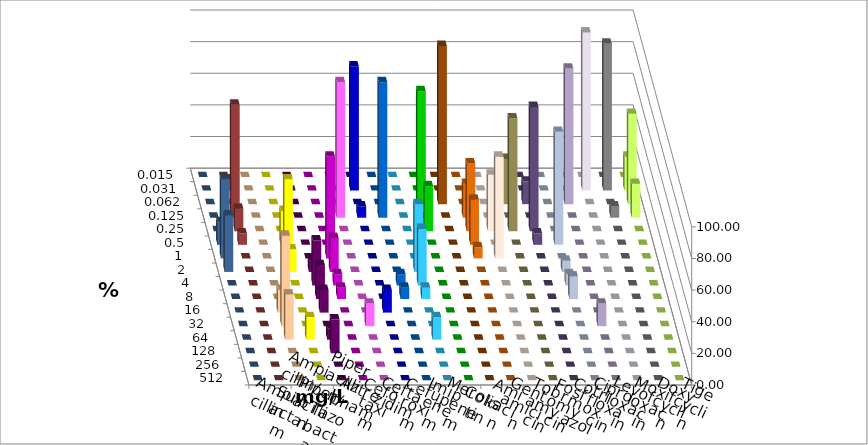
| Category | Ampicillin | Ampicillin/ Sulbactam | Piperacillin | Piperacillin/ Tazobactam | Aztreonam | Cefotaxim | Ceftazidim | Cefuroxim | Imipenem | Meropenem | Colistin | Amikacin | Gentamicin | Tobramycin | Fosfomycin | Cotrimoxazol | Ciprofloxacin | Levofloxacin | Moxifloxacin | Doxycyclin | Tigecyclin |
|---|---|---|---|---|---|---|---|---|---|---|---|---|---|---|---|---|---|---|---|---|---|
| 0.015 | 0 | 0 | 0 | 0 | 0 | 0 | 0 | 0 | 0 | 0 | 0 | 0 | 0 | 0 | 0 | 0 | 0 | 0 | 0 | 0 | 0 |
| 0.031 | 0 | 0 | 0 | 0 | 0 | 78.571 | 0 | 0 | 0 | 0 | 0 | 0 | 0 | 0 | 0 | 0 | 100 | 92.857 | 21.429 | 0 | 7.143 |
| 0.062 | 0 | 0 | 0 | 0 | 0 | 0 | 0 | 0 | 71.429 | 100 | 0 | 0 | 28.571 | 14.286 | 0 | 85.714 | 0 | 0 | 57.143 | 0 | 0 |
| 0.125 | 0 | 0 | 0 | 0 | 85.714 | 7.143 | 85.714 | 0 | 0 | 0 | 21.429 | 0 | 0 | 0 | 0 | 0 | 0 | 7.143 | 21.429 | 0 | 71.429 |
| 0.25 | 0 | 0 | 0 | 0 | 0 | 0 | 0 | 0 | 28.571 | 0 | 42.857 | 35.714 | 71.429 | 78.571 | 0 | 0 | 0 | 0 | 0 | 0 | 14.286 |
| 0.5 | 0 | 21.429 | 0 | 0 | 0 | 0 | 0 | 0 | 0 | 0 | 28.571 | 0 | 0 | 7.143 | 71.429 | 0 | 0 | 0 | 0 | 14.286 | 7.143 |
| 1.0 | 0 | 50 | 0 | 64.286 | 0 | 0 | 0 | 0 | 0 | 0 | 7.143 | 64.286 | 0 | 0 | 0 | 0 | 0 | 0 | 0 | 50 | 0 |
| 2.0 | 0 | 14.286 | 7.143 | 21.429 | 0 | 0 | 0 | 42.857 | 0 | 0 | 0 | 0 | 0 | 0 | 7.143 | 0 | 0 | 0 | 0 | 35.714 | 0 |
| 4.0 | 0 | 0 | 28.571 | 7.143 | 0 | 0 | 7.143 | 35.714 | 0 | 0 | 0 | 0 | 0 | 0 | 7.143 | 0 | 0 | 0 | 0 | 0 | 0 |
| 8.0 | 0 | 0 | 21.429 | 7.143 | 0 | 0 | 7.143 | 7.143 | 0 | 0 | 0 | 0 | 0 | 0 | 14.286 | 0 | 0 | 0 | 0 | 0 | 0 |
| 16.0 | 14.286 | 0 | 14.286 | 0 | 0 | 14.286 | 0 | 0 | 0 | 0 | 0 | 0 | 0 | 0 | 0 | 0 | 0 | 0 | 0 | 0 | 0 |
| 32.0 | 57.143 | 0 | 0 | 0 | 14.286 | 0 | 0 | 0 | 0 | 0 | 0 | 0 | 0 | 0 | 0 | 14.286 | 0 | 0 | 0 | 0 | 0 |
| 64.0 | 28.571 | 14.286 | 7.143 | 0 | 0 | 0 | 0 | 14.286 | 0 | 0 | 0 | 0 | 0 | 0 | 0 | 0 | 0 | 0 | 0 | 0 | 0 |
| 128.0 | 0 | 0 | 21.429 | 0 | 0 | 0 | 0 | 0 | 0 | 0 | 0 | 0 | 0 | 0 | 0 | 0 | 0 | 0 | 0 | 0 | 0 |
| 256.0 | 0 | 0 | 0 | 0 | 0 | 0 | 0 | 0 | 0 | 0 | 0 | 0 | 0 | 0 | 0 | 0 | 0 | 0 | 0 | 0 | 0 |
| 512.0 | 0 | 0 | 0 | 0 | 0 | 0 | 0 | 0 | 0 | 0 | 0 | 0 | 0 | 0 | 0 | 0 | 0 | 0 | 0 | 0 | 0 |